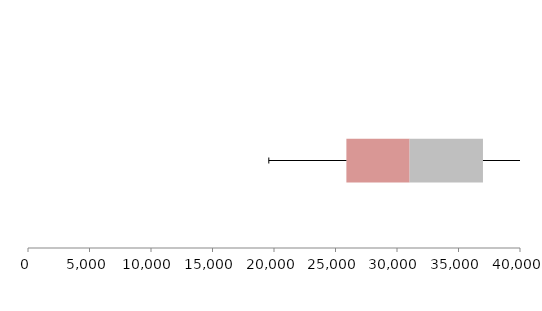
| Category | Series 1 | Series 2 | Series 3 |
|---|---|---|---|
| 0 | 25885.152 | 5141.114 | 5963.527 |